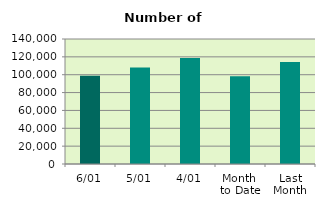
| Category | Series 0 |
|---|---|
| 6/01 | 98806 |
| 5/01 | 107970 |
| 4/01 | 118674 |
| Month 
to Date | 98274.4 |
| Last
Month | 114251.429 |